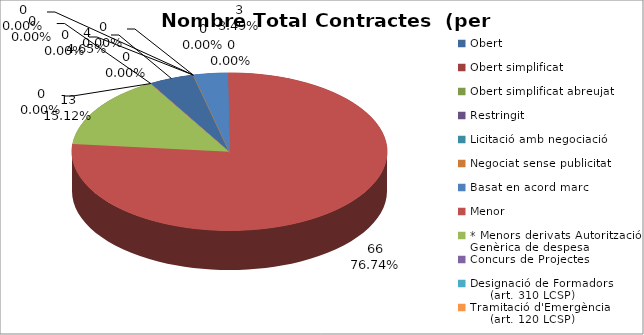
| Category | Nombre Total Contractes |
|---|---|
| Obert | 4 |
| Obert simplificat | 0 |
| Obert simplificat abreujat | 0 |
| Restringit | 0 |
| Licitació amb negociació | 0 |
| Negociat sense publicitat | 0 |
| Basat en acord marc | 3 |
| Menor | 66 |
| * Menors derivats Autorització Genèrica de despesa | 13 |
| Concurs de Projectes | 0 |
| Designació de Formadors
     (art. 310 LCSP) | 0 |
| Tramitació d'Emergència
     (art. 120 LCSP) | 0 |